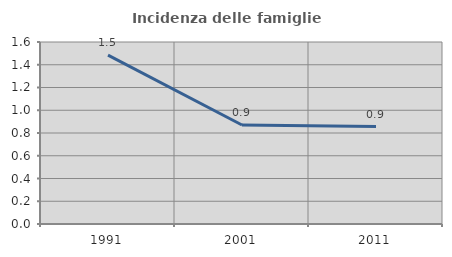
| Category | Incidenza delle famiglie numerose |
|---|---|
| 1991.0 | 1.484 |
| 2001.0 | 0.87 |
| 2011.0 | 0.857 |